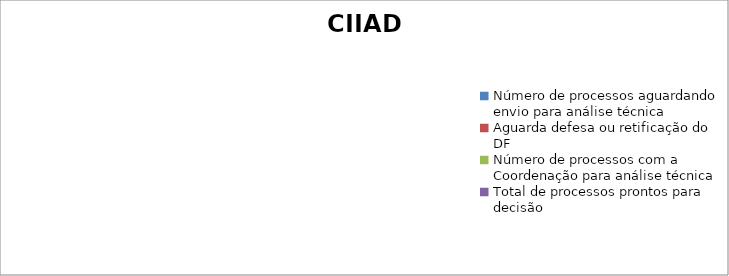
| Category | CIIAD |
|---|---|
| Número de processos aguardando envio para análise técnica | 0 |
| Aguarda defesa ou retificação do DF | 0 |
| Número de processos com a Coordenação para análise técnica | 0 |
| Total de processos prontos para decisão | 0 |